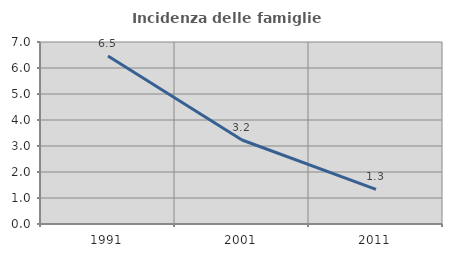
| Category | Incidenza delle famiglie numerose |
|---|---|
| 1991.0 | 6.461 |
| 2001.0 | 3.23 |
| 2011.0 | 1.33 |